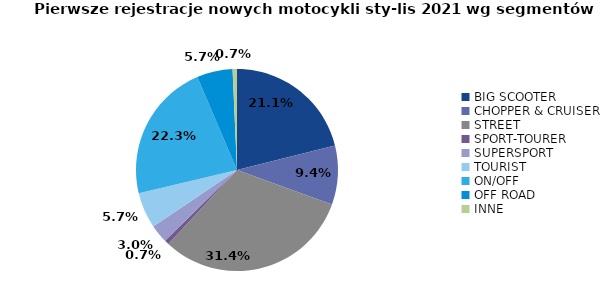
| Category | Series 0 |
|---|---|
| 0 | 4552 |
| 1 | 2036 |
| 2 | 6770 |
| 3 | 155 |
| 4 | 634 |
| 5 | 1237 |
| 6 | 4810 |
| 7 | 1234 |
| 8 | 151 |